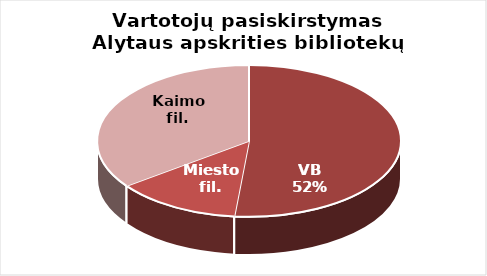
| Category | Vartotojų pasiskirstymas Alytaus apskrities bibliotekų padaliniuose |
|---|---|
| VB | 22494 |
| Miesto fil. | 5830 |
| Kaimo fil. | 15317 |